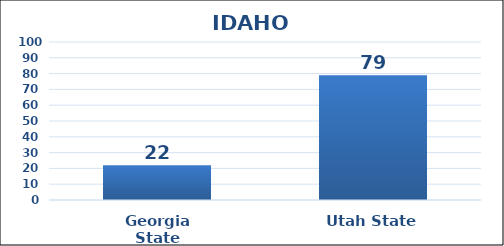
| Category | Series 0 |
|---|---|
| Georgia State | 22 |
| Utah State | 79 |